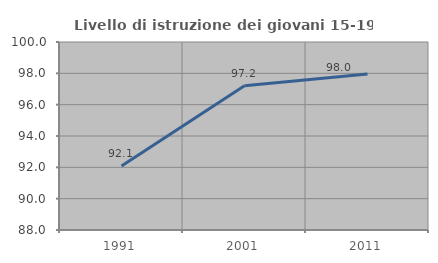
| Category | Livello di istruzione dei giovani 15-19 anni |
|---|---|
| 1991.0 | 92.092 |
| 2001.0 | 97.21 |
| 2011.0 | 97.956 |